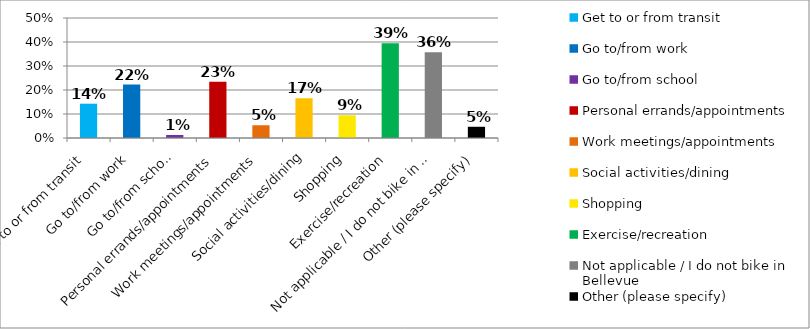
| Category | Responses |
|---|---|
| Get to or from transit | 0.143 |
| Go to/from work | 0.222 |
| Go to/from school | 0.013 |
| Personal errands/appointments | 0.234 |
| Work meetings/appointments | 0.053 |
| Social activities/dining | 0.166 |
| Shopping | 0.095 |
| Exercise/recreation | 0.394 |
| Not applicable / I do not bike in Bellevue | 0.358 |
| Other (please specify) | 0.047 |